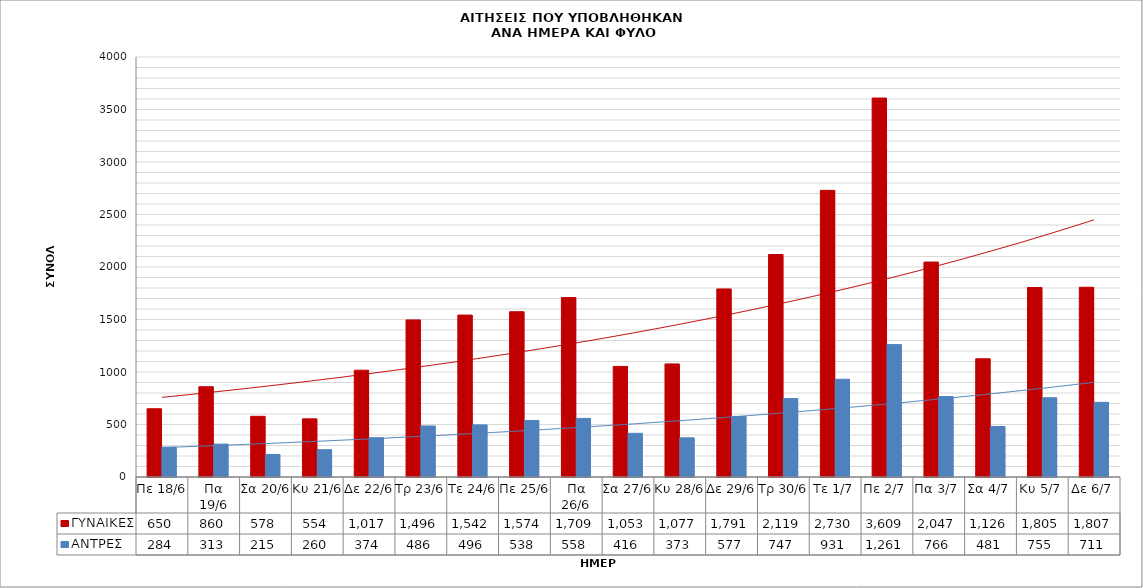
| Category | ΓΥΝΑΙΚΕΣ | ΑΝΤΡΕΣ |
|---|---|---|
| Πε 18/6 | 650 | 284 |
| Πα 19/6 | 860 | 313 |
| Σα 20/6 | 578 | 215 |
| Κυ 21/6 | 554 | 260 |
| Δε 22/6 | 1017 | 374 |
| Τρ 23/6 | 1496 | 486 |
| Τε 24/6 | 1542 | 496 |
| Πε 25/6 | 1574 | 538 |
| Πα 26/6 | 1709 | 558 |
| Σα 27/6 | 1053 | 416 |
| Κυ 28/6 | 1077 | 373 |
| Δε 29/6 | 1791 | 577 |
| Τρ 30/6 | 2119 | 747 |
| Τε 1/7 | 2730 | 931 |
| Πε 2/7 | 3609 | 1261 |
| Πα 3/7 | 2047 | 766 |
| Σα 4/7 | 1126 | 481 |
| Κυ 5/7 | 1805 | 755 |
| Δε 6/7 | 1807 | 711 |